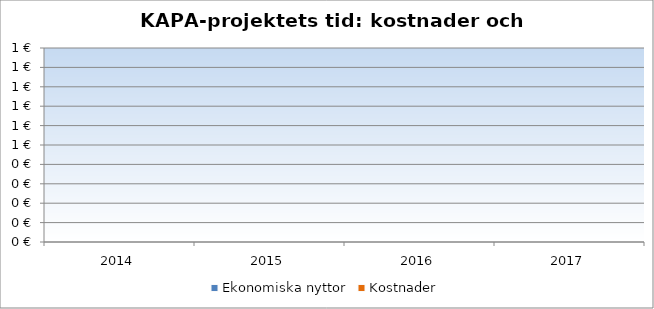
| Category | Ekonomiska nyttor | Kostnader |
|---|---|---|
| 2014.0 | 0 | 0 |
| 2015.0 | 0 | 0 |
| 2016.0 | 0 | 0 |
| 2017.0 | 0 | 0 |